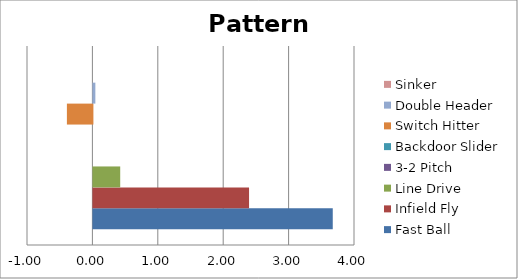
| Category | Fast Ball | Infield Fly | Line Drive | 3-2 Pitch | Backdoor Slider | Switch Hitter | Double Header | Sinker |
|---|---|---|---|---|---|---|---|---|
| 0 | 3.66 | 2.38 | 0.41 | 0 | 0 | -0.39 | 0.03 | 0 |